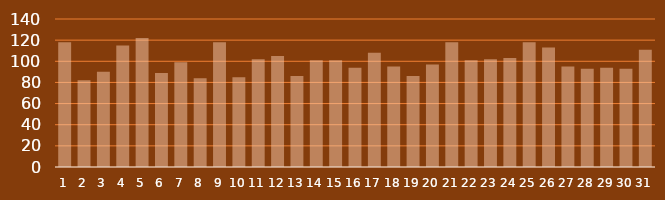
| Category | MQLs |
|---|---|
| 1.0 | 118 |
| 2.0 | 82 |
| 3.0 | 90 |
| 4.0 | 115 |
| 5.0 | 122 |
| 6.0 | 89 |
| 7.0 | 99 |
| 8.0 | 84 |
| 9.0 | 118 |
| 10.0 | 85 |
| 11.0 | 102 |
| 12.0 | 105 |
| 13.0 | 86 |
| 14.0 | 101 |
| 15.0 | 101 |
| 16.0 | 94 |
| 17.0 | 108 |
| 18.0 | 95 |
| 19.0 | 86 |
| 20.0 | 97 |
| 21.0 | 118 |
| 22.0 | 101 |
| 23.0 | 102 |
| 24.0 | 103 |
| 25.0 | 118 |
| 26.0 | 113 |
| 27.0 | 95 |
| 28.0 | 93 |
| 29.0 | 94 |
| 30.0 | 93 |
| 31.0 | 111 |